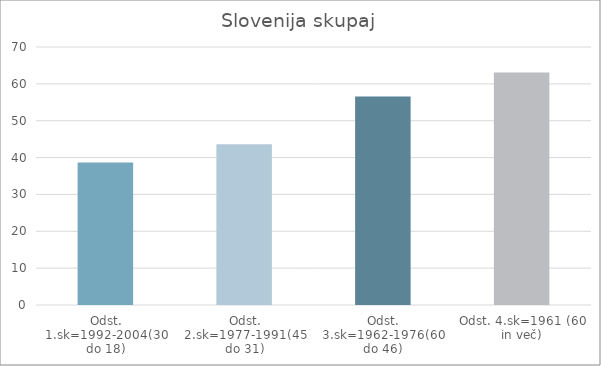
| Category | Series 0 |
|---|---|
| Odst. 1.sk=1992-2004(30 do 18) | 38.68 |
| Odst. 2.sk=1977-1991(45 do 31) | 43.59 |
| Odst. 3.sk=1962-1976(60 do 46) | 56.54 |
| Odst. 4.sk=1961 (60 in več) | 63.07 |